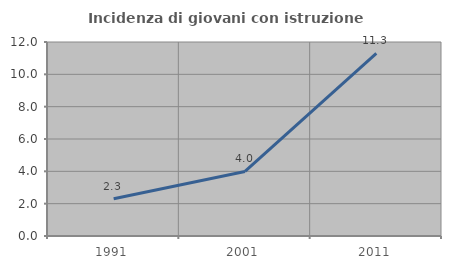
| Category | Incidenza di giovani con istruzione universitaria |
|---|---|
| 1991.0 | 2.307 |
| 2001.0 | 3.991 |
| 2011.0 | 11.296 |